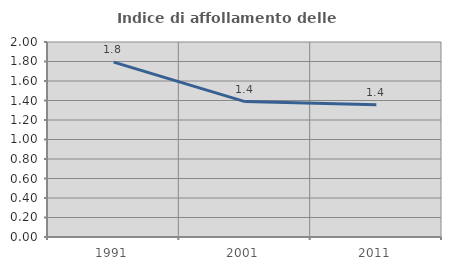
| Category | Indice di affollamento delle abitazioni  |
|---|---|
| 1991.0 | 1.794 |
| 2001.0 | 1.389 |
| 2011.0 | 1.357 |